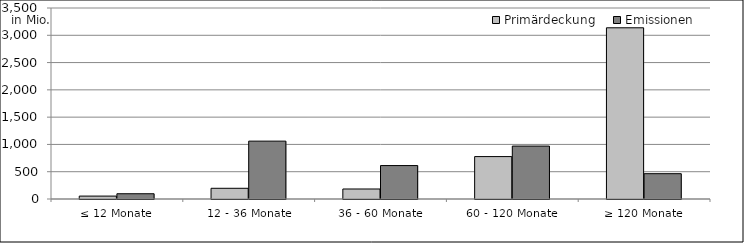
| Category | Primärdeckung | Emissionen |
|---|---|---|
| ≤ 12 Monate | 53298923.35 | 96362235.65 |
| 12 - 36 Monate | 196242873.305 | 1060500000 |
| 36 - 60 Monate | 183405442.532 | 612650000 |
| 60 - 120 Monate | 777361972.42 | 970000000 |
| ≥ 120 Monate | 3137309145.974 | 463886730.94 |